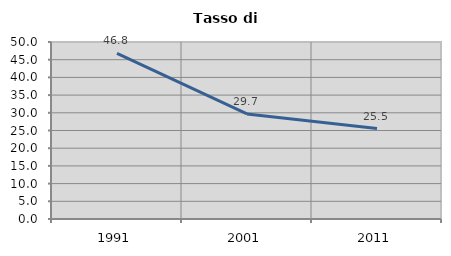
| Category | Tasso di disoccupazione   |
|---|---|
| 1991.0 | 46.774 |
| 2001.0 | 29.688 |
| 2011.0 | 25.534 |